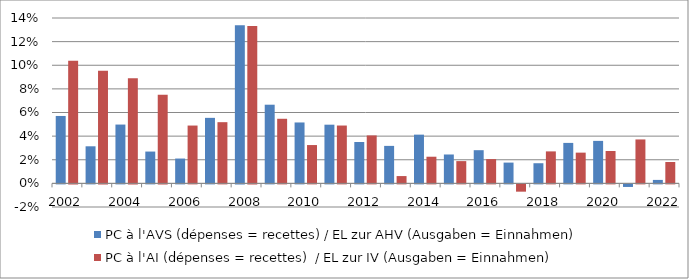
| Category | PC à l'AVS (dépenses = recettes) / EL zur AHV (Ausgaben = Einnahmen) | PC à l'AI (dépenses = recettes)  / EL zur IV (Ausgaben = Einnahmen) |
|---|---|---|
| 2002 | 0.057 | 0.104 |
| 2003* | 0.031 | 0.095 |
| 2004 | 0.05 | 0.089 |
| 2005* | 0.027 | 0.075 |
| 2006 | 0.021 | 0.049 |
| 2007* | 0.055 | 0.052 |
| 2008 | 0.134 | 0.133 |
| 2009* | 0.067 | 0.055 |
| 2010 | 0.052 | 0.032 |
| 2011* | 0.05 | 0.049 |
| 2012 | 0.035 | 0.041 |
| 2013* | 0.032 | 0.006 |
| 2014 | 0.041 | 0.023 |
| 2015* | 0.024 | 0.019 |
| 2016 | 0.028 | 0.021 |
| 2017 | 0.018 | -0.006 |
| 2018 | 0.017 | 0.027 |
| 2019* | 0.034 | 0.026 |
| 2020 | 0.036 | 0.027 |
| 2021 | -0.002 | 0.037 |
| 2022 | 0.003 | 0.018 |